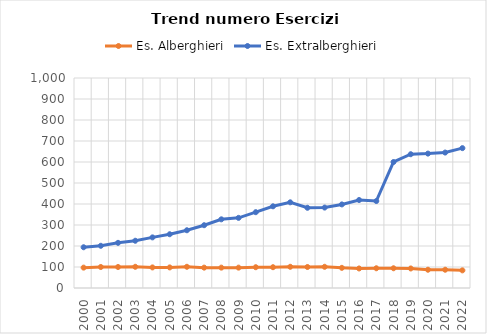
| Category | Es. Alberghieri | Es. Extralberghieri |
|---|---|---|
| 2000.0 | 97 | 194 |
| 2001.0 | 100 | 201 |
| 2002.0 | 100 | 215 |
| 2003.0 | 101 | 225 |
| 2004.0 | 98 | 241 |
| 2005.0 | 98 | 256 |
| 2006.0 | 101 | 275 |
| 2007.0 | 97 | 299 |
| 2008.0 | 97 | 327 |
| 2009.0 | 97 | 334 |
| 2010.0 | 99 | 361 |
| 2011.0 | 99 | 389 |
| 2012.0 | 101 | 408 |
| 2013.0 | 100 | 382 |
| 2014.0 | 101 | 383 |
| 2015.0 | 96 | 398 |
| 2016.0 | 93 | 419 |
| 2017.0 | 94 | 414 |
| 2018.0 | 94 | 600 |
| 2019.0 | 93 | 637 |
| 2020.0 | 87 | 640 |
| 2021.0 | 87 | 645 |
| 2022.0 | 84 | 666 |